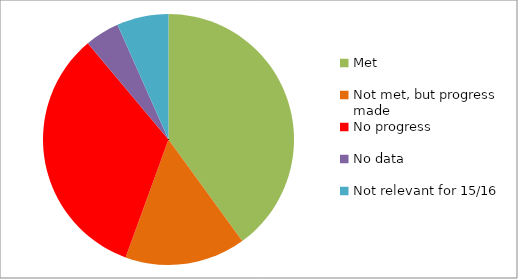
| Category | Series 0 |
|---|---|
| Met | 18 |
| Not met, but progress made | 7 |
| No progress | 15 |
| No data | 2 |
| Not relevant for 15/16 | 3 |